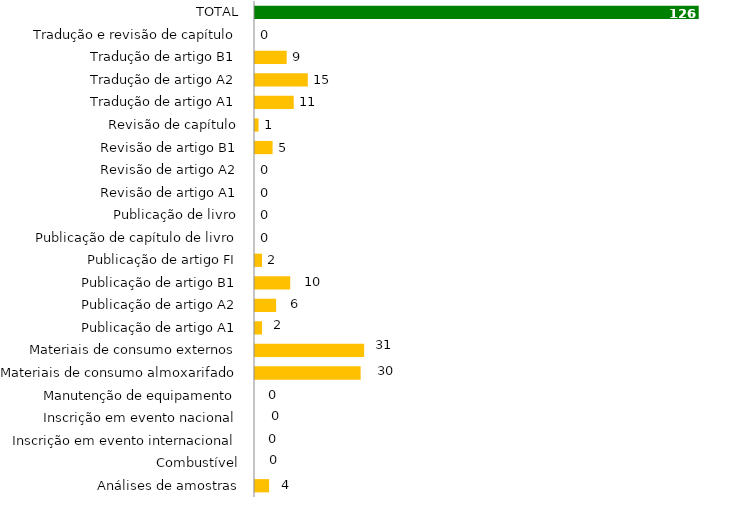
| Category | Series 1 |
|---|---|
| Análises de amostras | 4 |
| Combustível | 0 |
| Inscrição em evento internacional | 0 |
| Inscrição em evento nacional | 0 |
| Manutenção de equipamento | 0 |
| Materiais de consumo almoxarifado | 30 |
| Materiais de consumo externos | 31 |
| Publicação de artigo A1 | 2 |
| Publicação de artigo A2 | 6 |
| Publicação de artigo B1 | 10 |
| Publicação de artigo FI | 2 |
| Publicação de capítulo de livro | 0 |
| Publicação de livro | 0 |
| Revisão de artigo A1 | 0 |
| Revisão de artigo A2 | 0 |
| Revisão de artigo B1 | 5 |
| Revisão de capítulo | 1 |
| Tradução de artigo A1 | 11 |
| Tradução de artigo A2 | 15 |
| Tradução de artigo B1 | 9 |
| Tradução e revisão de capítulo | 0 |
| TOTAL | 126 |